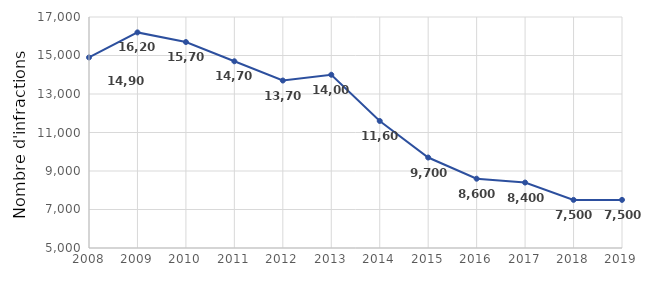
| Category | Series 0 |
|---|---|
| 2008.0 | 14900 |
| 2009.0 | 16200 |
| 2010.0 | 15700 |
| 2011.0 | 14700 |
| 2012.0 | 13700 |
| 2013.0 | 14000 |
| 2014.0 | 11600 |
| 2015.0 | 9700 |
| 2016.0 | 8600 |
| 2017.0 | 8400 |
| 2018.0 | 7500 |
| 2019.0 | 7500 |